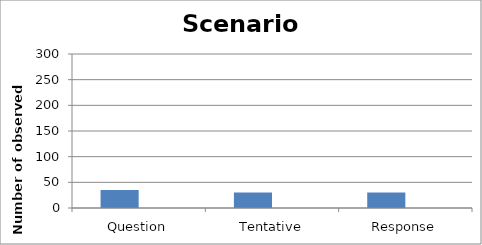
| Category | Observed count | Minimum possible |
|---|---|---|
| Question | 35 | 0 |
| Tentative | 30 | 0 |
| Response | 30 | 0 |